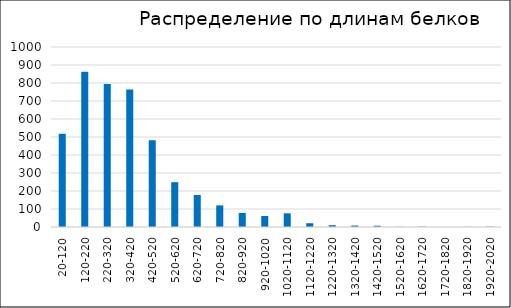
| Category | Series 0 |
|---|---|
| 20-120 | 518 |
| 120-220 | 863 |
| 220-320 | 795 |
| 320-420 | 764 |
| 420-520 | 482 |
| 520-620 | 249 |
| 620-720 | 178 |
| 720-820 | 120 |
| 820-920 | 78 |
| 920-1020 | 61 |
| 1020-1120 | 76 |
| 1120-1220 | 21 |
| 1220-1320 | 10 |
| 1320-1420 | 8 |
| 1420-1520 | 7 |
| 1520-1620 | 1 |
| 1620-1720 | 2 |
| 1720-1820 | 0 |
| 1820-1920 | 1 |
| 1920-2020 | 2 |